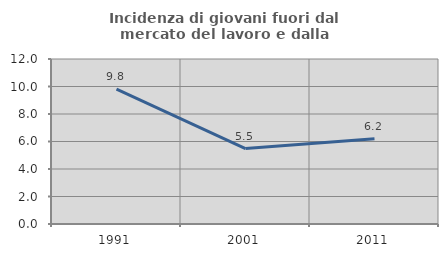
| Category | Incidenza di giovani fuori dal mercato del lavoro e dalla formazione  |
|---|---|
| 1991.0 | 9.814 |
| 2001.0 | 5.49 |
| 2011.0 | 6.208 |